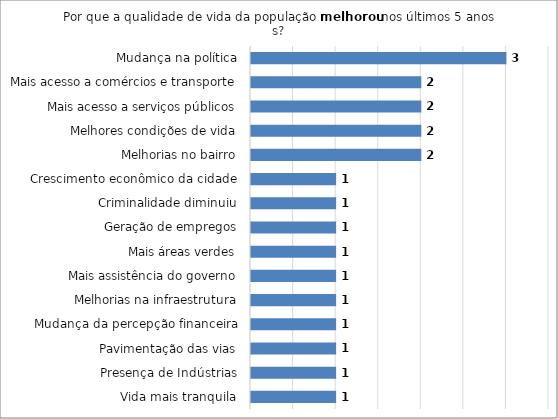
| Category | Series 0 |
|---|---|
| Vida mais tranquila | 1 |
| Presença de Indústrias | 1 |
| Pavimentação das vias | 1 |
| Mudança da percepção financeira | 1 |
| Melhorias na infraestrutura | 1 |
| Mais assistência do governo | 1 |
| Mais áreas verdes | 1 |
| Geração de empregos | 1 |
| Criminalidade diminuiu | 1 |
| Crescimento econômico da cidade | 1 |
| Melhorias no bairro | 2 |
| Melhores condições de vida | 2 |
| Mais acesso a serviços públicos | 2 |
| Mais acesso a comércios e transporte | 2 |
| Mudança na política | 3 |